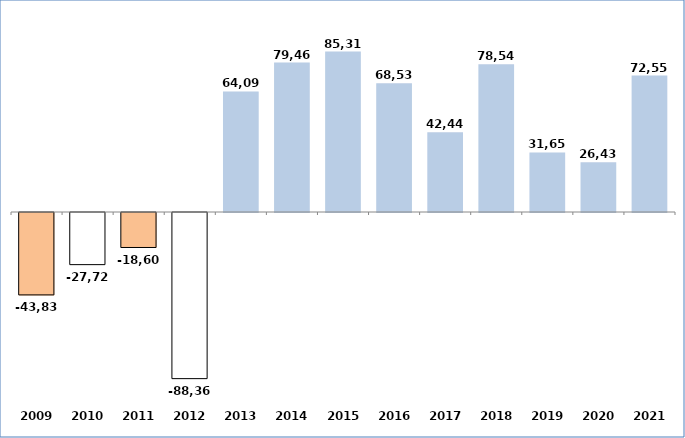
| Category | Series 0 |
|---|---|
| 2009 | -43830.09 |
| 2010 | -27727.75 |
| 2011 | -18608.8 |
| 2012 | -88366.91 |
| 2013 | 64096.85 |
| 2014 | 79462.77 |
| 2015 | 85313.53 |
| 2016 | 68530.62 |
| 2017 | 42444.32 |
| 2018 | 78540.98 |
| 2019 | 31659 |
| 2020 | 26432 |
| 2021 | 72553.401 |